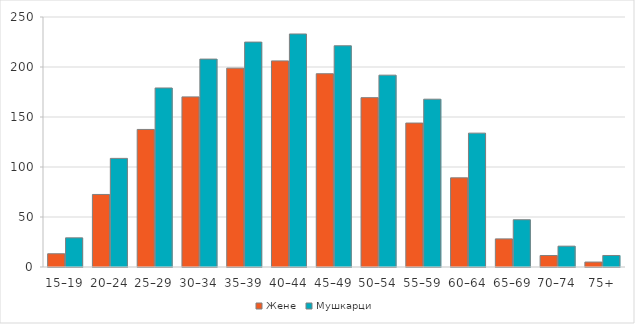
| Category | Жене | Мушкарци |
|---|---|---|
| 15–19 | 13.235 | 29.159 |
| 20–24 | 72.532 | 108.616 |
| 25–29 | 137.559 | 179.025 |
| 30–34 | 170.121 | 207.903 |
| 35–39 | 198.844 | 224.913 |
| 40–44 | 206.106 | 233.028 |
| 45–49 | 193.265 | 221.221 |
| 50–54 | 169.341 | 191.841 |
| 55–59 | 143.953 | 167.799 |
| 60–64 | 89.169 | 133.869 |
| 65–69 | 28.102 | 47.257 |
| 70–74 | 11.48 | 20.836 |
| 75+ | 4.943 | 11.509 |